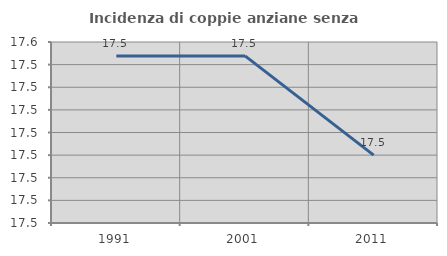
| Category | Incidenza di coppie anziane senza figli  |
|---|---|
| 1991.0 | 17.544 |
| 2001.0 | 17.544 |
| 2011.0 | 17.5 |